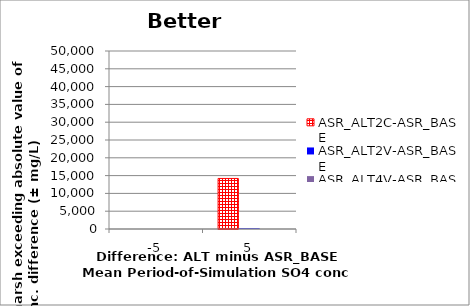
| Category | ASR_ALT2C-ASR_BASE | ASR_ALT2V-ASR_BASE | ASR_ALT4V-ASR_BASE |
|---|---|---|---|
| -5.0 | 0 | 0 | 0 |
| 5.0 | 14200 | 175 | 0 |